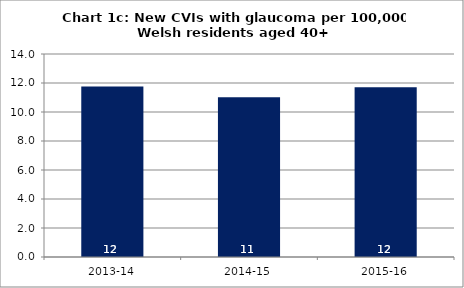
| Category | Chart 1c: New CVIs with glaucoma per 100,000 Welsh residents aged 40+ |
|---|---|
| 2013-14 | 11.76 |
| 2014-15 | 11.015 |
| 2015-16 | 11.714 |